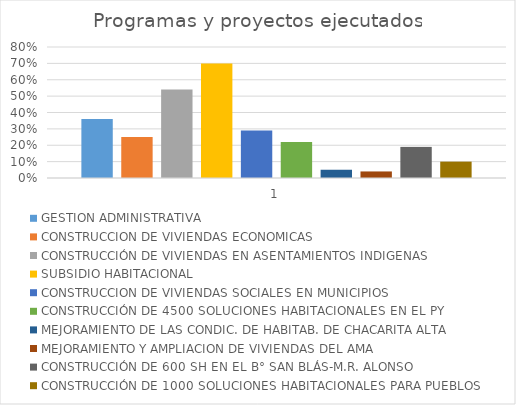
| Category | GESTION ADMINISTRATIVA | CONSTRUCCION DE VIVIENDAS ECONOMICAS | CONSTRUCCIÓN DE VIVIENDAS EN ASENTAMIENTOS INDIGENAS | SUBSIDIO HABITACIONAL | CONSTRUCCION DE VIVIENDAS SOCIALES EN MUNICIPIOS | CONSTRUCCIÓN DE 4500 SOLUCIONES HABITACIONALES EN EL PY | MEJORAMIENTO DE LAS CONDIC. DE HABITAB. DE CHACARITA ALTA | MEJORAMIENTO Y AMPLIACION DE VIVIENDAS DEL AMA | CONSTRUCCIÓN DE 600 SH EN EL B° SAN BLÁS-M.R. ALONSO | CONSTRUCCIÓN DE 1000 SOLUCIONES HABITACIONALES PARA PUEBLOS |
|---|---|---|---|---|---|---|---|---|---|---|
| 0 | 0.36 | 0.25 | 0.54 | 0.7 | 0.29 | 0.22 | 0.05 | 0.04 | 0.19 | 0.1 |